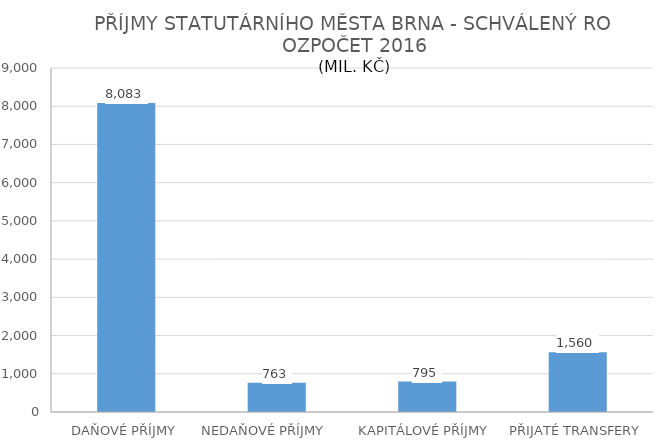
| Category | Series 0 |
|---|---|
| DAŇOVÉ PŘÍJMY | 8083.453 |
| NEDAŇOVÉ PŘÍJMY              | 763.089 |
| KAPITÁLOVÉ PŘÍJMY  | 794.785 |
| PŘIJATÉ TRANSFERY | 1560.329 |